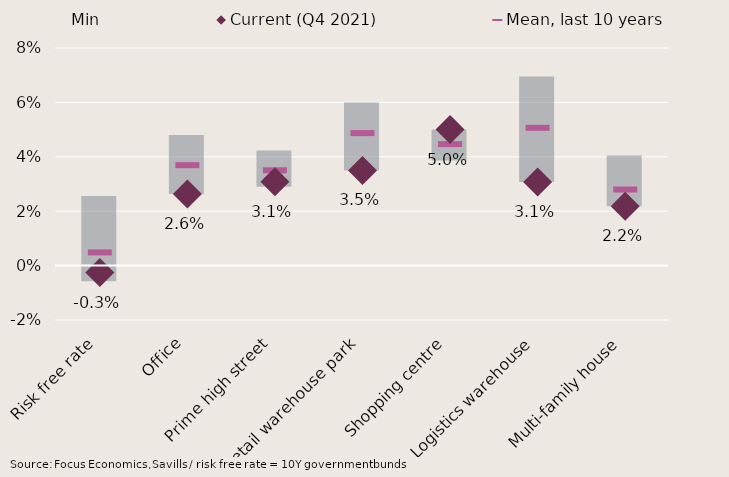
| Category | Min | Range min/max, last 10 years |
|---|---|---|
| Risk free rate | -0.006 | 0.026 |
| Office | 0.026 | 0.022 |
| Prime high street | 0.029 | 0.013 |
| Retail warehouse park | 0.035 | 0.025 |
| Shopping centre | 0.039 | 0.011 |
| Logistics warehouse | 0.031 | 0.039 |
| Multi-family house | 0.022 | 0.019 |